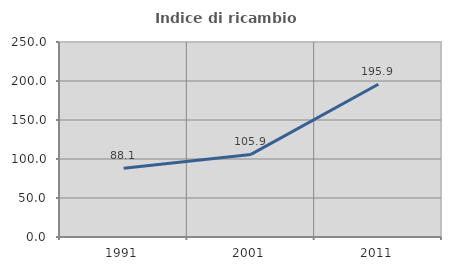
| Category | Indice di ricambio occupazionale  |
|---|---|
| 1991.0 | 88.095 |
| 2001.0 | 105.882 |
| 2011.0 | 195.89 |